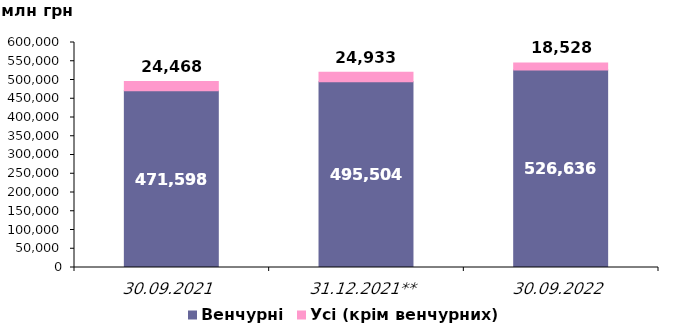
| Category | Венчурні | Усі (крім венчурних) |
|---|---|---|
| 30.09.2021 | 471598.282 | 24468.121 |
| 31.12.2021** | 495503.925 | 24933.195 |
| 30.09.2022 | 526635.614 | 18527.657 |